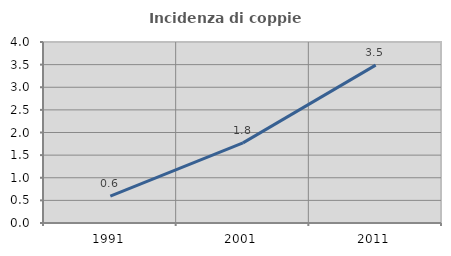
| Category | Incidenza di coppie miste |
|---|---|
| 1991.0 | 0.594 |
| 2001.0 | 1.77 |
| 2011.0 | 3.488 |